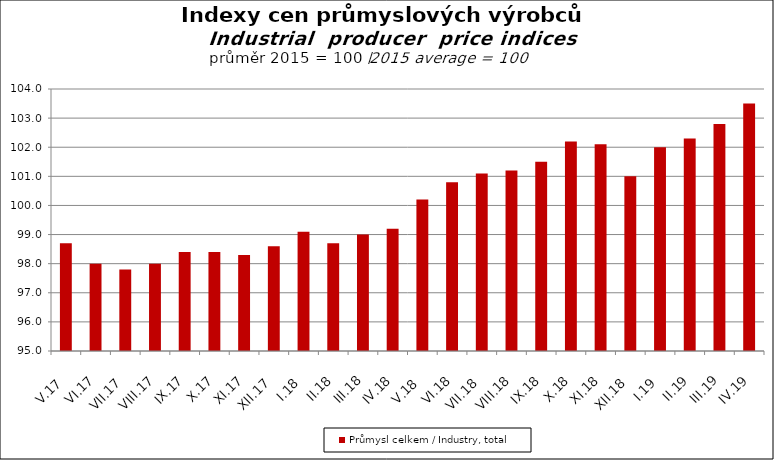
| Category | Průmysl celkem / Industry, total |
|---|---|
| V.17 | 98.7 |
| VI.17 | 98 |
| VII.17 | 97.8 |
| VIII.17 | 98 |
| IX.17 | 98.4 |
| X.17 | 98.4 |
| XI.17 | 98.3 |
| XII.17 | 98.6 |
| I.18 | 99.1 |
| II.18 | 98.7 |
| III.18 | 99 |
| IV.18 | 99.2 |
| V.18 | 100.2 |
| VI.18 | 100.8 |
| VII.18 | 101.1 |
| VIII.18 | 101.2 |
| IX.18 | 101.5 |
| X.18 | 102.2 |
| XI.18 | 102.1 |
| XII.18 | 101 |
| I.19 | 102 |
| II.19 | 102.3 |
| III.19 | 102.8 |
| IV.19 | 103.5 |